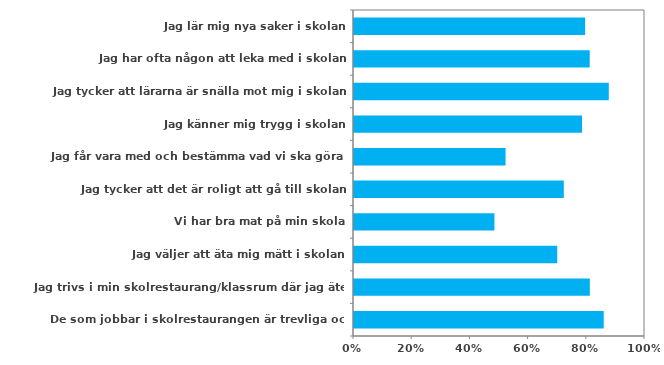
| Category | (Alla) |
|---|---|
| Jag lär mig nya saker i skolan | 0.794 |
| Jag har ofta någon att leka med i skolan | 0.81 |
| Jag tycker att lärarna är snälla mot mig i skolan | 0.876 |
| Jag känner mig trygg i skolan | 0.784 |
| Jag får vara med och bestämma vad vi ska göra i skolan | 0.521 |
| Jag tycker att det är roligt att gå till skolan | 0.721 |
| Vi har bra mat på min skola | 0.483 |
| Jag väljer att äta mig mätt i skolan | 0.698 |
| Jag trivs i min skolrestaurang/klassrum där jag äter maten | 0.81 |
| De som jobbar i skolrestaurangen är trevliga och hjälpsamma | 0.858 |